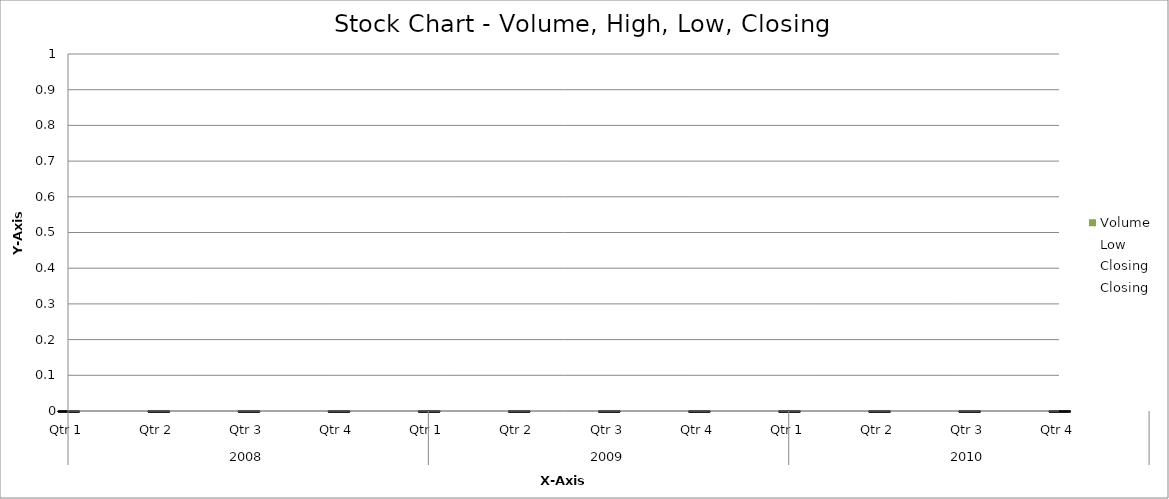
| Category | Volume |
|---|---|
| 0 | 125 |
| 1 | 149 |
| 2 | 127 |
| 3 | 137 |
| 4 | 127 |
| 5 | 142 |
| 6 | 130 |
| 7 | 128 |
| 8 | 149 |
| 9 | 131 |
| 10 | 131 |
| 11 | 137 |